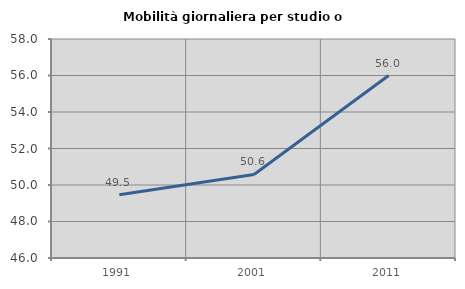
| Category | Mobilità giornaliera per studio o lavoro |
|---|---|
| 1991.0 | 49.466 |
| 2001.0 | 50.577 |
| 2011.0 | 55.995 |